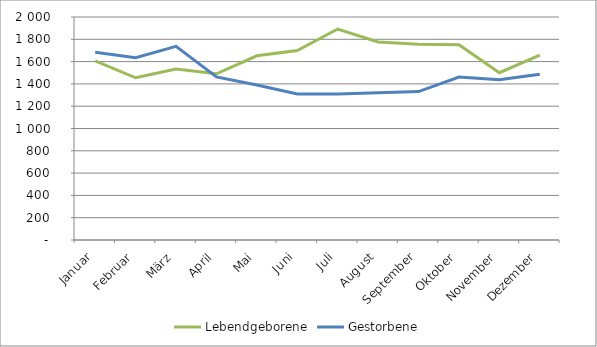
| Category | Lebendgeborene | Gestorbene |
|---|---|---|
| Januar | 1606 | 1683 |
| Februar | 1455 | 1634 |
| März | 1533 | 1737 |
| April | 1491 | 1463 |
| Mai | 1652 | 1390 |
| Juni | 1699 | 1310 |
| Juli | 1892 | 1310 |
| August | 1776 | 1320 |
| September | 1755 | 1331 |
| Oktober | 1752 | 1462 |
| November | 1500 | 1438 |
| Dezember | 1657 | 1487 |